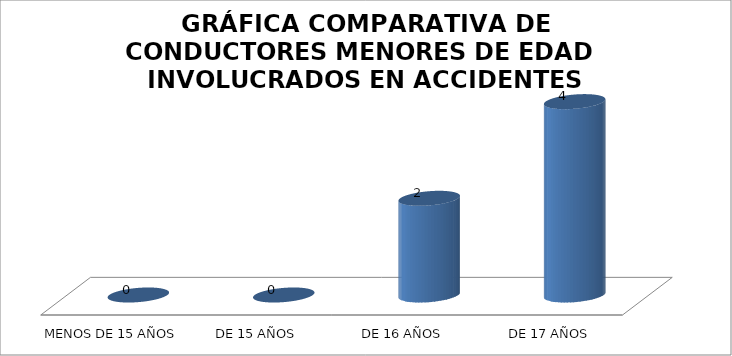
| Category | Series 0 |
|---|---|
| MENOS DE 15 AÑOS | 0 |
| DE 15 AÑOS | 0 |
| DE 16 AÑOS | 2 |
|  DE 17 AÑOS | 4 |